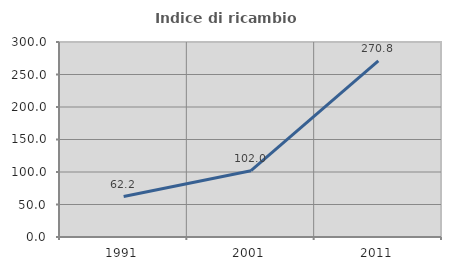
| Category | Indice di ricambio occupazionale  |
|---|---|
| 1991.0 | 62.227 |
| 2001.0 | 102.034 |
| 2011.0 | 270.833 |